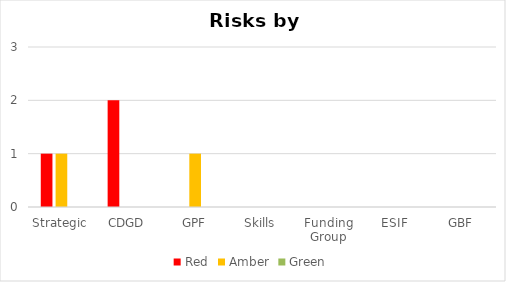
| Category | Red | Amber | Green |
|---|---|---|---|
| Strategic | 1 | 1 | 0 |
| CDGD | 2 | 0 | 0 |
| GPF | 0 | 1 | 0 |
| Skills | 0 | 0 | 0 |
| Funding Group | 0 | 0 | 0 |
| ESIF | 0 | 0 | 0 |
| GBF | 0 | 0 | 0 |